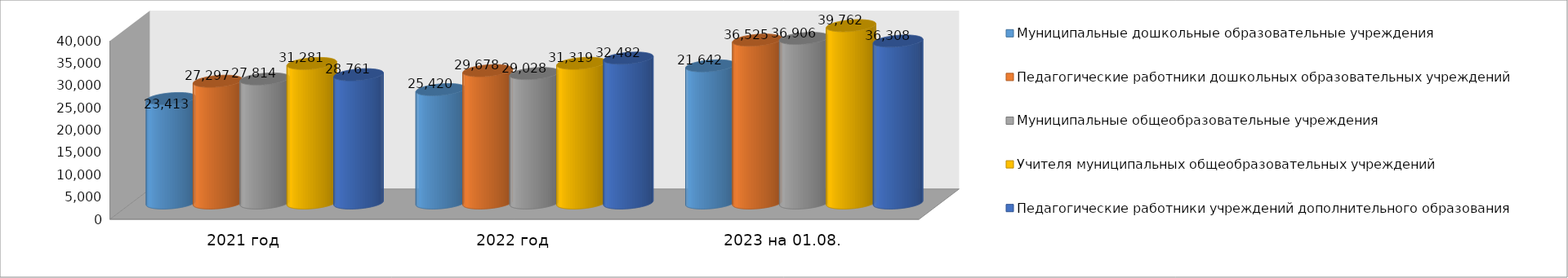
| Category | Муниципальные дошкольные образовательные учреждения | Педагогические работники дошкольных образовательных учреждений | Муниципальные общеобразовательные учреждения | Учителя муниципальных общеобразовательных учреждений | Педагогические работники учреждений дополнительного образования |
|---|---|---|---|---|---|
| 2021 год | 23413 | 27297 | 27814 | 31281 | 28761 |
| 2022 год | 25420 | 29678 | 29028 | 31319 | 32482 |
| 2023 на 01.08. | 30759 | 36525 | 36906 | 39762 | 36308 |